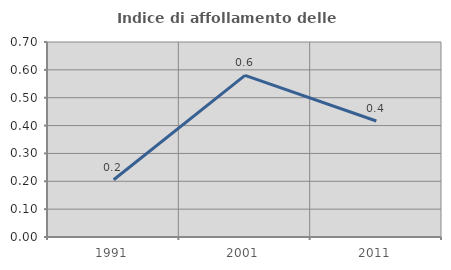
| Category | Indice di affollamento delle abitazioni  |
|---|---|
| 1991.0 | 0.206 |
| 2001.0 | 0.58 |
| 2011.0 | 0.416 |